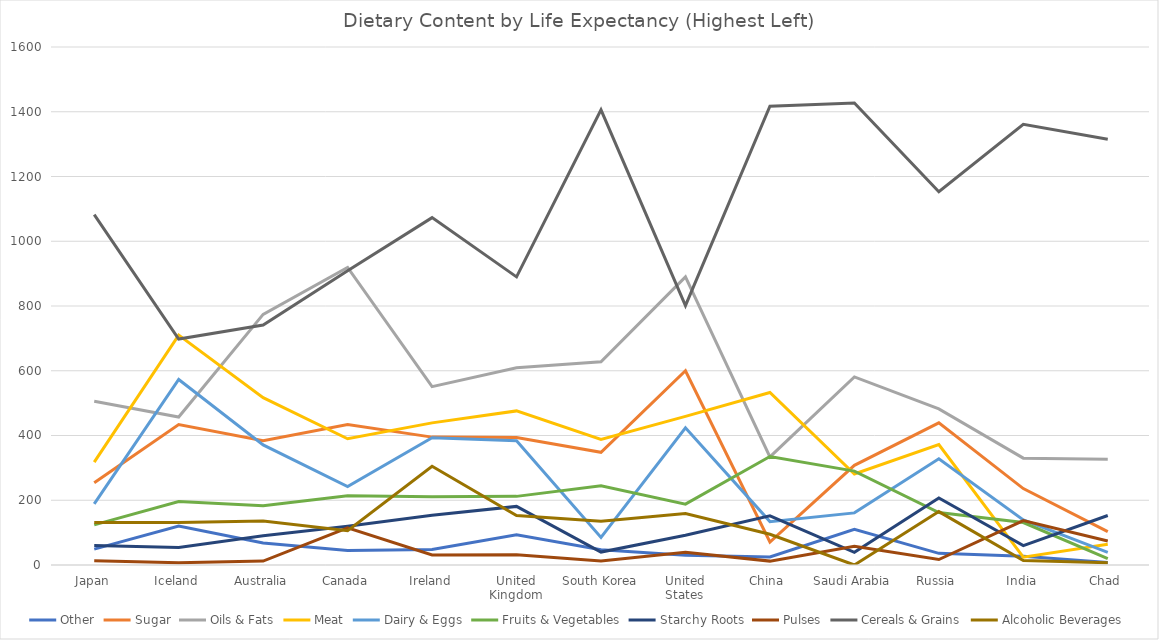
| Category | Other | Sugar | Oils & Fats | Meat | Dairy & Eggs | Fruits & Vegetables | Starchy Roots | Pulses | Cereals & Grains | Alcoholic Beverages |
|---|---|---|---|---|---|---|---|---|---|---|
| Japan | 49 | 254 | 506 | 318 | 189 | 124 | 60 | 13 | 1082 | 131 |
| Iceland | 120 | 434 | 457 | 710 | 573 | 196 | 54 | 7 | 698 | 131 |
| Australia | 68 | 384 | 774 | 517 | 371 | 183 | 90 | 12 | 741 | 136 |
| Canada | 45 | 434 | 919 | 390 | 242 | 214 | 120 | 115 | 909 | 106 |
| Ireland | 48 | 395 | 551 | 439 | 393 | 211 | 154 | 31 | 1073 | 305 |
| United Kingdom | 93 | 394 | 609 | 476 | 384 | 212 | 181 | 32 | 890 | 153 |
| South Korea | 47 | 348 | 628 | 388 | 85 | 245 | 40 | 12 | 1406 | 135 |
| United States | 30 | 600 | 890 | 459 | 424 | 188 | 92 | 39 | 801 | 159 |
| China | 25 | 71 | 334 | 533 | 134 | 335 | 152 | 12 | 1417 | 95 |
| Saudi Arabia | 110 | 308 | 581 | 281 | 161 | 290 | 39 | 58 | 1427 | 0 |
| Russia | 36 | 439 | 482 | 372 | 328 | 162 | 207 | 17 | 1153 | 165 |
| India | 27 | 236 | 330 | 24 | 139 | 131 | 60 | 137 | 1361 | 14 |
| Chad | 8 | 103 | 327 | 64 | 39 | 20 | 153 | 74 | 1315 | 7 |